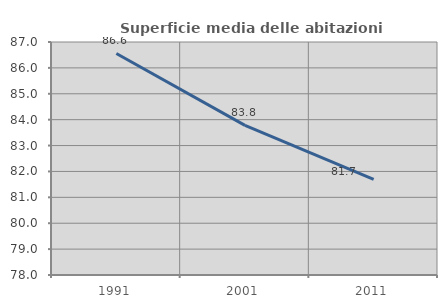
| Category | Superficie media delle abitazioni occupate |
|---|---|
| 1991.0 | 86.557 |
| 2001.0 | 83.779 |
| 2011.0 | 81.694 |